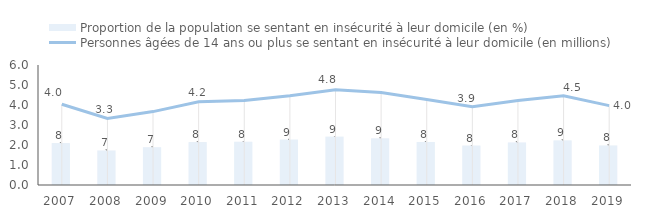
| Category | Proportion de la population se sentant en insécurité à leur domicile (en %) |
|---|---|
| 2007.0 | 8.03 |
| 2008.0 | 6.62 |
| 2009.0 | 7.24 |
| 2010.0 | 8.22 |
| 2011.0 | 8.29 |
| 2012.0 | 8.72 |
| 2013.0 | 9.28 |
| 2014.0 | 8.95 |
| 2015.0 | 8.25 |
| 2016.0 | 7.56 |
| 2017.0 | 8.16 |
| 2018.0 | 8.55 |
| 2019.0 | 7.59 |